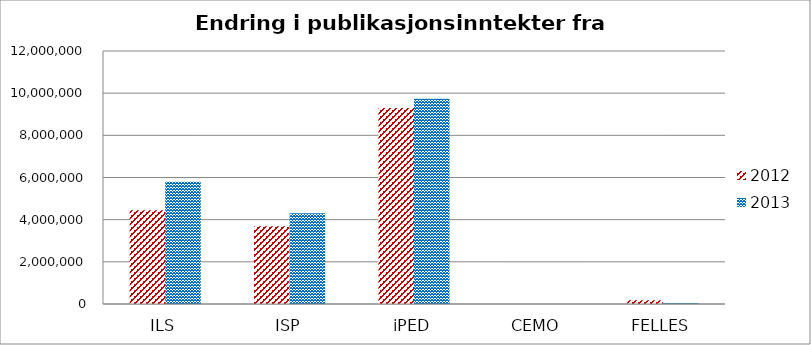
| Category | 2012 | 2013 |
|---|---|---|
| ILS | 4443600 | 5799066.667 |
| ISP | 3686133 | 4305600 |
| iPED | 9295067 | 9736666.667 |
| CEMO | 0 | 0 |
| FELLES | 180933 | 36800 |